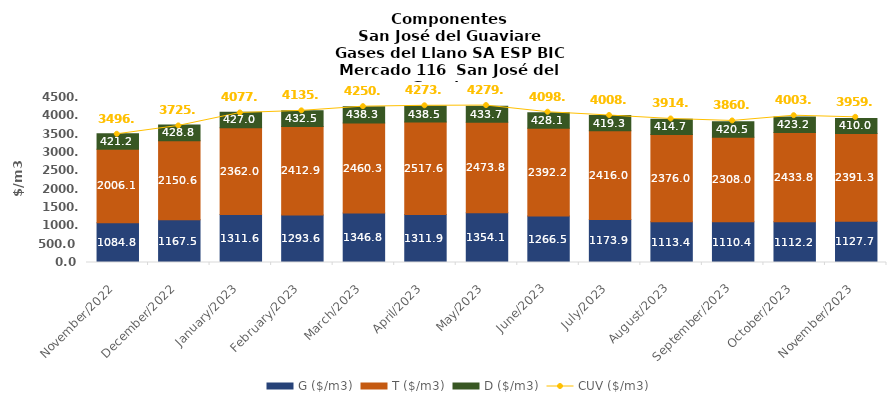
| Category | G ($/m3) | T ($/m3) | D ($/m3) |
|---|---|---|---|
| 2022-11-01 | 1084.79 | 2006.14 | 421.15 |
| 2022-12-01 | 1167.54 | 2150.64 | 428.78 |
| 2023-01-01 | 1311.57 | 2362.01 | 427.02 |
| 2023-02-01 | 1293.59 | 2412.88 | 432.47 |
| 2023-03-01 | 1346.83 | 2460.32 | 438.26 |
| 2023-04-01 | 1311.89 | 2517.58 | 438.54 |
| 2023-05-01 | 1354.14 | 2473.76 | 433.72 |
| 2023-06-01 | 1266.52 | 2392.24 | 428.13 |
| 2023-07-01 | 1173.91 | 2415.98 | 419.29 |
| 2023-08-01 | 1113.38 | 2375.96 | 414.65 |
| 2023-09-01 | 1110.42 | 2307.98 | 420.53 |
| 2023-10-01 | 1112.24 | 2433.8 | 423.16 |
| 2023-11-01 | 1127.7 | 2391.33 | 410 |